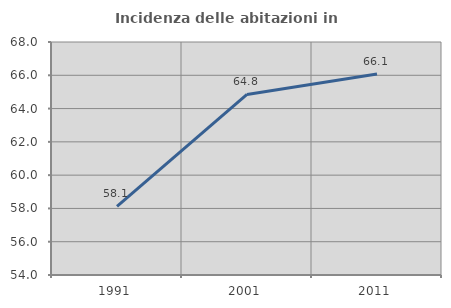
| Category | Incidenza delle abitazioni in proprietà  |
|---|---|
| 1991.0 | 58.128 |
| 2001.0 | 64.848 |
| 2011.0 | 66.083 |